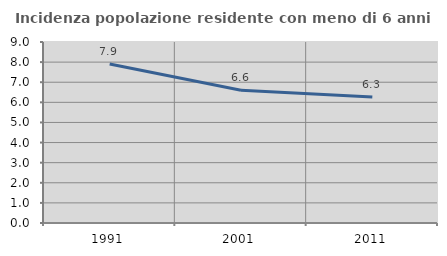
| Category | Incidenza popolazione residente con meno di 6 anni |
|---|---|
| 1991.0 | 7.901 |
| 2001.0 | 6.6 |
| 2011.0 | 6.267 |